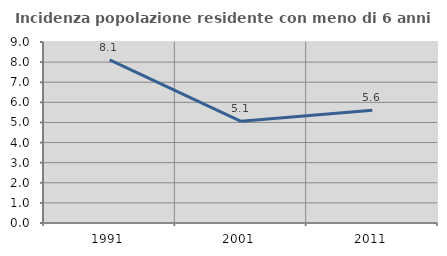
| Category | Incidenza popolazione residente con meno di 6 anni |
|---|---|
| 1991.0 | 8.107 |
| 2001.0 | 5.055 |
| 2011.0 | 5.61 |